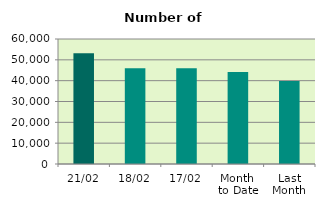
| Category | Series 0 |
|---|---|
| 21/02 | 53162 |
| 18/02 | 45966 |
| 17/02 | 45946 |
| Month 
to Date | 44148.267 |
| Last
Month | 39786.667 |